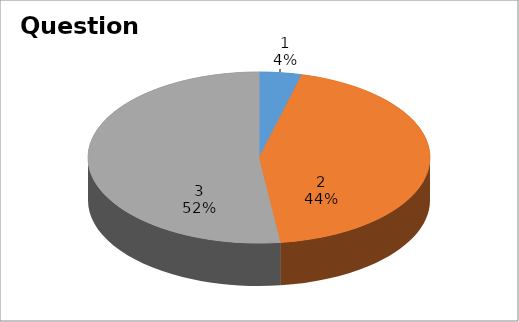
| Category | Series 0 |
|---|---|
| 0 | 1 |
| 1 | 11 |
| 2 | 13 |